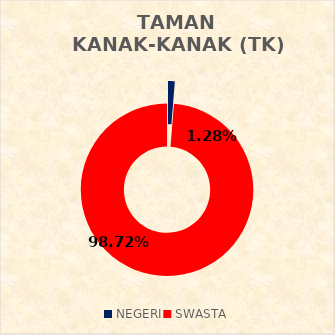
| Category | TAMAN KANAK-KANAK (TK) STATUS SEKOLAH |
|---|---|
| NEGERI | 6 |
| SWASTA | 464 |